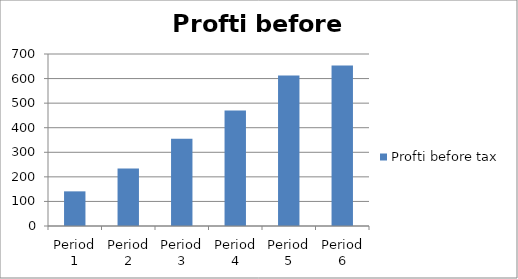
| Category | Profti before tax |
|---|---|
| Period 1 | 141 |
| Period 2 | 234 |
| Period 3 | 355.504 |
| Period 4 | 470.403 |
| Period 5 | 612.168 |
| Period 6 | 653.225 |